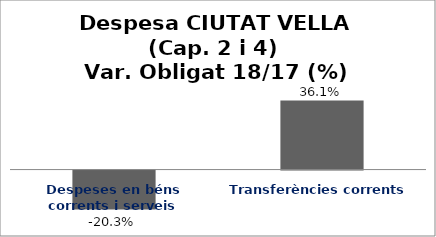
| Category | Series 0 |
|---|---|
| Despeses en béns corrents i serveis | -0.203 |
| Transferències corrents | 0.361 |